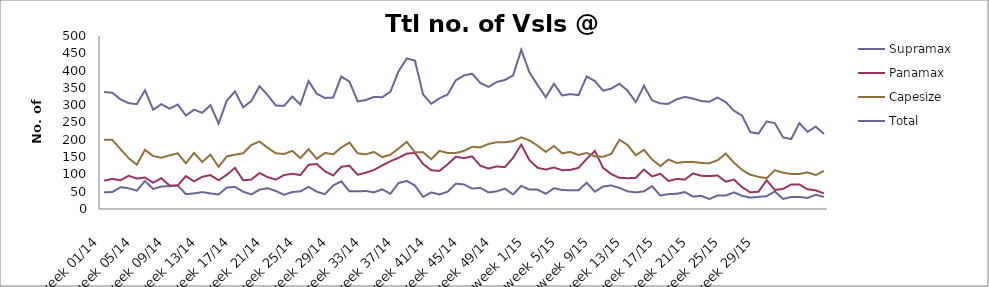
| Category | Supramax | Panamax | Capesize | Total |
|---|---|---|---|---|
| week 01/14 | 48 | 82 | 200 | 338 |
| week 02/14 | 49 | 87 | 200 | 336 |
| week 03/14 | 63 | 83 | 173 | 317 |
| week 04/14 | 60 | 96 | 147 | 306 |
| week 05/14 | 53 | 88 | 128 | 303 |
| week 06/14 | 81 | 91 | 171 | 343 |
| week 07/14 | 58 | 76 | 153 | 287 |
| week 08/14 | 65 | 89 | 148 | 303 |
| week 09/14 | 66 | 68 | 155 | 290 |
| week 10/14 | 68 | 68 | 161 | 302 |
| week 11/14 | 43 | 95 | 132 | 270 |
| week 12/14 | 45 | 80 | 162 | 287 |
| week 13/14 | 49 | 93 | 136 | 278 |
| week 14/14 | 45 | 98 | 157 | 300 |
| week 15/14 | 42 | 83 | 122 | 247 |
| week 16/14 | 62 | 99 | 152 | 313 |
| week 17/14 | 64 | 119 | 157 | 340 |
| week 18/14 | 50 | 83 | 161 | 294 |
| week 19/14 | 42 | 85 | 185 | 312 |
| week 20/14 | 56 | 104 | 195 | 355 |
| week 21/14 | 60 | 92 | 177 | 329 |
| week 22/14 | 52 | 85 | 161 | 299 |
| week 23/14 | 41 | 98 | 159 | 298 |
| week 24/14 | 49 | 102 | 168 | 325 |
| week 25/14 | 51 | 98 | 147 | 302 |
| week 26/14 | 64 | 128 | 173 | 370 |
| week 27/14 | 50 | 130 | 145 | 333 |
| week 28/14 | 43 | 109 | 162 | 321 |
| week 29/14 | 68 | 97 | 158 | 322 |
| week 30/14 | 80 | 122 | 178 | 383 |
| week 31/14 | 51 | 125 | 192 | 368 |
| week 32/14 | 51 | 99 | 161 | 311 |
| week 33/14 | 52 | 105 | 158 | 315 |
| week 34/14 | 48 | 113 | 165 | 324 |
| week 35/14 | 57 | 126 | 150 | 323 |
| week 36/14 | 44 | 138 | 157 | 339 |
| week 37/14 | 75 | 148 | 175 | 398 |
| week 38/14 | 81 | 160 | 194 | 435 |
| week 39/14 | 68 | 162 | 164 | 429 |
| week 40/14 | 35 | 130 | 164 | 331 |
| week 41/14 | 48 | 112 | 144 | 304 |
| week 42/14 | 42 | 110 | 168 | 320 |
| week 43/14 | 50 | 129 | 162 | 331 |
| week 44/14 | 73 | 151 | 162 | 372 |
| week 45/14 | 71 | 147 | 168 | 386 |
| week 46/14 | 59 | 152 | 180 | 391 |
| week 47/14 | 61 | 125 | 178 | 364 |
| week 48/14 | 48 | 117 | 188 | 353 |
| week 49/14 | 51 | 123 | 193 | 367 |
| week 50/14 | 59 | 121 | 193 | 373 |
| week 51/14 | 42 | 148 | 196 | 386 |
| week 52/14 | 67 | 186 | 207 | 460 |
| week 1/15 | 56 | 141 | 198 | 395 |
| week 2/15 | 56 | 119 | 183 | 358 |
| week 3/15 | 44 | 114 | 165 | 323 |
| week 4/15 | 60 | 120 | 182 | 362 |
| week 5/15 | 55 | 112 | 161 | 328 |
| week 6/15 | 54 | 113 | 165 | 332 |
| week 7/15 | 54 | 119 | 156 | 329 |
| week 8/15 | 76 | 145 | 162 | 383 |
| week 9/15 | 50 | 168 | 152 | 370 |
| week 10/15 | 65 | 119 | 151 | 342 |
| week 11/15 | 68 | 101 | 159 | 348 |
| week 12/15 | 61 | 90 | 200 | 362 |
| week 13/15 | 51 | 89 | 185 | 342 |
| week 14/15 | 48 | 90 | 155 | 309 |
| week 15/15 | 51 | 114 | 171 | 356 |
| week 16/15 | 66 | 94 | 143 | 314 |
| week 17/15 | 39 | 102 | 124 | 305 |
| week 18/15 | 43 | 81 | 143 | 304 |
| week 19/15 | 44 | 87 | 133 | 317 |
| week 20/15 | 49 | 85 | 136 | 324 |
| week 21/15 | 36 | 103 | 136 | 319 |
| week 22/15 | 38 | 96 | 133 | 312 |
| week 23/15 | 29 | 95 | 132 | 310 |
| week 24/15 | 39 | 97 | 141 | 322 |
| week 25/15 | 39 | 79 | 160 | 309 |
| week 26/15 | 48 | 85 | 134 | 284 |
| week 27/15 | 38 | 63 | 113 | 270 |
| week 28/15 | 33 | 48 | 99 | 222 |
| week 29/15 | 35 | 50 | 93 | 218 |
| week 30/15 | 37 | 83 | 89 | 253 |
| week 31/15 | 51 | 55 | 112 | 248 |